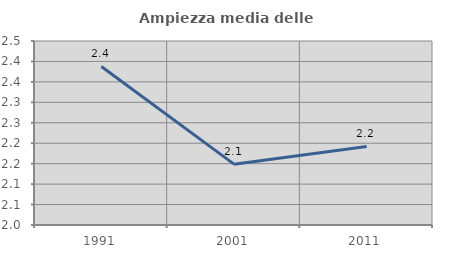
| Category | Ampiezza media delle famiglie |
|---|---|
| 1991.0 | 2.388 |
| 2001.0 | 2.149 |
| 2011.0 | 2.192 |